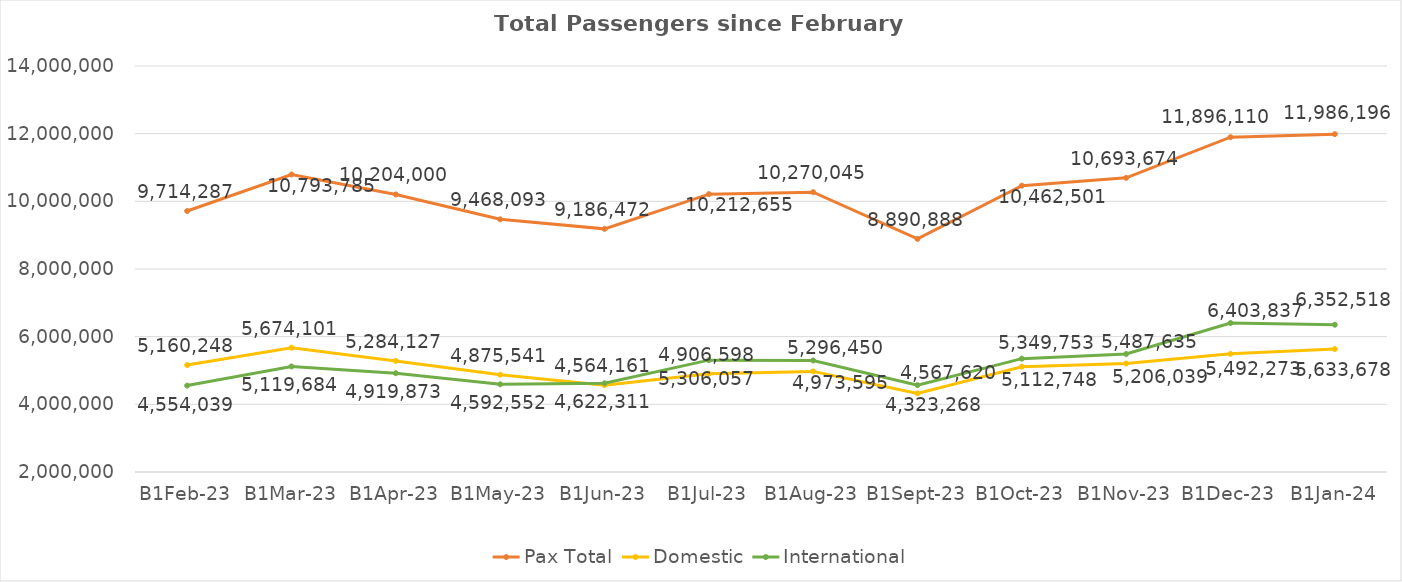
| Category | Pax Total | Domestic | International |
|---|---|---|---|
| 2023-02-01 | 9714287 | 5160248 | 4554039 |
| 2023-03-01 | 10793785 | 5674101 | 5119684 |
| 2023-04-01 | 10204000 | 5284127 | 4919873 |
| 2023-05-01 | 9468093 | 4875541 | 4592552 |
| 2023-06-01 | 9186472 | 4564161 | 4622311 |
| 2023-07-01 | 10212655 | 4906598 | 5306057 |
| 2023-08-01 | 10270045 | 4973595 | 5296450 |
| 2023-09-01 | 8890888 | 4323268 | 4567620 |
| 2023-10-01 | 10462501 | 5112748 | 5349753 |
| 2023-11-01 | 10693674 | 5206039 | 5487635 |
| 2023-12-01 | 11896110 | 5492273 | 6403837 |
| 2024-01-01 | 11986196 | 5633678 | 6352518 |